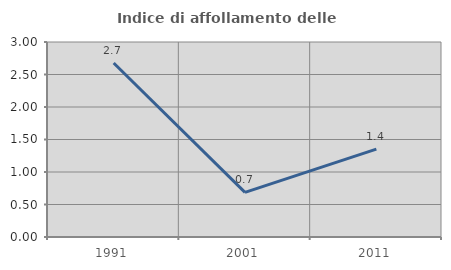
| Category | Indice di affollamento delle abitazioni  |
|---|---|
| 1991.0 | 2.677 |
| 2001.0 | 0.686 |
| 2011.0 | 1.353 |